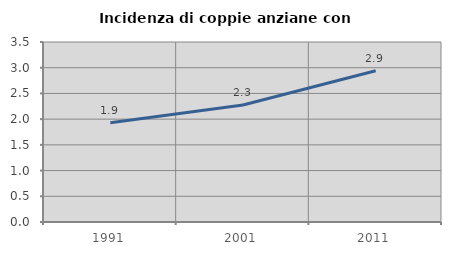
| Category | Incidenza di coppie anziane con figli |
|---|---|
| 1991.0 | 1.932 |
| 2001.0 | 2.274 |
| 2011.0 | 2.941 |